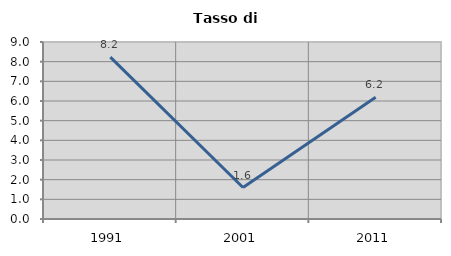
| Category | Tasso di disoccupazione   |
|---|---|
| 1991.0 | 8.228 |
| 2001.0 | 1.6 |
| 2011.0 | 6.186 |